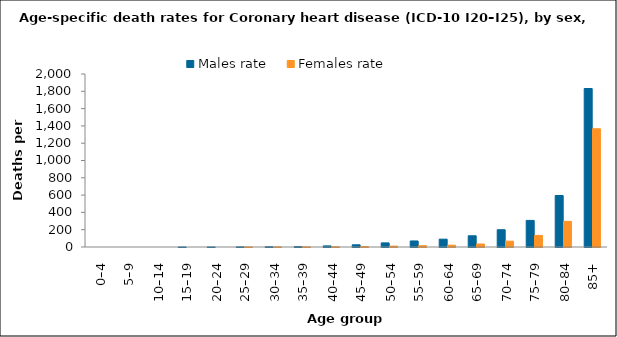
| Category | Males rate | Females rate |
|---|---|---|
| 0–4 | 0 | 0 |
| 5–9 | 0 | 0 |
| 10–14 | 0 | 0 |
| 15–19 | 0.131 | 0 |
| 20–24 | 0.239 | 0 |
| 25–29 | 1.307 | 0.332 |
| 30–34 | 2.977 | 0.73 |
| 35–39 | 4.848 | 1.171 |
| 40–44 | 12.747 | 2.385 |
| 45–49 | 25.45 | 4.683 |
| 50–54 | 47.598 | 10.277 |
| 55–59 | 69.767 | 14.848 |
| 60–64 | 90.552 | 21.49 |
| 65–69 | 129.871 | 34.711 |
| 70–74 | 199.75 | 67.221 |
| 75–79 | 307.599 | 134.254 |
| 80–84 | 595.29 | 296.839 |
| 85+ | 1832.226 | 1367.06 |